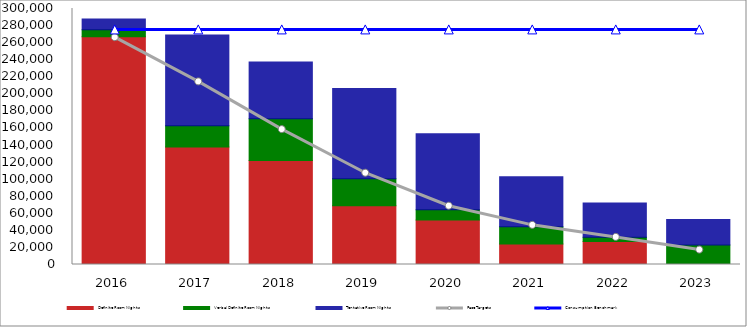
| Category | Definite Room Nights | Verbal Definite Room Nights | Tentative Room Nights |
|---|---|---|---|
| 2016.0 | 266985 | 8018 | 12731 |
| 2017.0 | 137651 | 24878 | 106510 |
| 2018.0 | 121918 | 48887 | 66534 |
| 2019.0 | 68899 | 31699 | 105541 |
| 2020.0 | 52056 | 12090 | 89060 |
| 2021.0 | 23925 | 20387 | 58432 |
| 2022.0 | 27014 | 5000 | 39974 |
| 2023.0 | 0 | 22743 | 29874 |